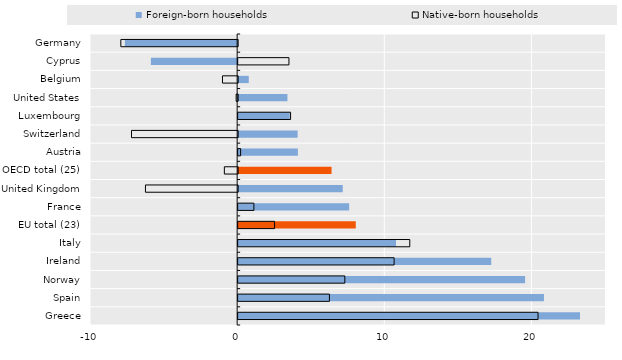
| Category | Foreign-born households | Native-born households |
|---|---|---|
| Germany | -7.63 | -7.938 |
| Cyprus | -5.861 | 3.453 |
| Belgium | 0.722 | -1.03 |
| United States | 3.35 | -0.1 |
| Luxembourg | 3.508 | 3.563 |
| Switzerland | 4.043 | -7.214 |
| Austria | 4.06 | 0.169 |
| OECD total (25) | 6.348 | -0.903 |
| United Kingdom | 7.11 | -6.266 |
| France | 7.545 | 1.07 |
| EU total (23) | 7.994 | 2.475 |
| Italy | 10.73 | 11.664 |
| Ireland | 17.2 | 10.6 |
| Norway | 19.5 | 7.25 |
| Spain | 20.783 | 6.204 |
| Greece | 23.232 | 20.38 |